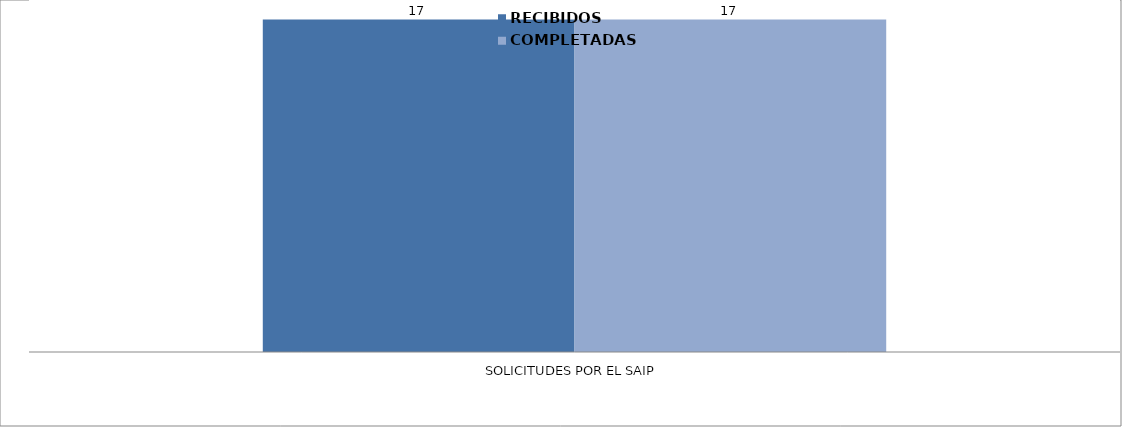
| Category | RECIBIDOS | COMPLETADAS |
|---|---|---|
| SOLICITUDES POR EL SAIP | 17 | 17 |